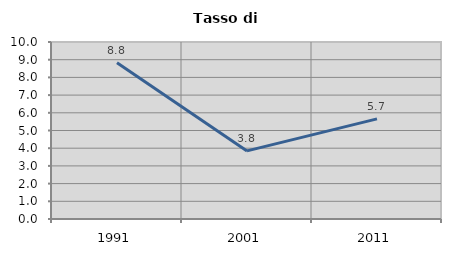
| Category | Tasso di disoccupazione   |
|---|---|
| 1991.0 | 8.831 |
| 2001.0 | 3.848 |
| 2011.0 | 5.659 |